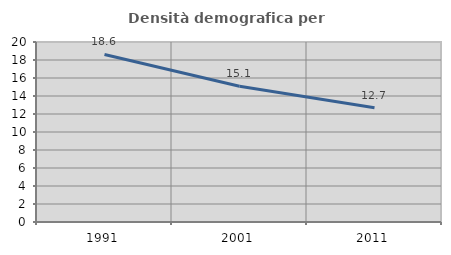
| Category | Densità demografica |
|---|---|
| 1991.0 | 18.615 |
| 2001.0 | 15.09 |
| 2011.0 | 12.684 |